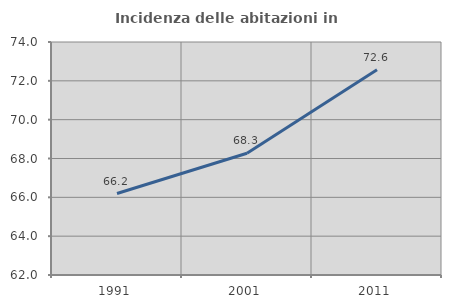
| Category | Incidenza delle abitazioni in proprietà  |
|---|---|
| 1991.0 | 66.197 |
| 2001.0 | 68.273 |
| 2011.0 | 72.575 |